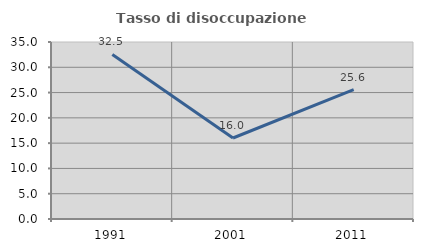
| Category | Tasso di disoccupazione giovanile  |
|---|---|
| 1991.0 | 32.53 |
| 2001.0 | 16.017 |
| 2011.0 | 25.57 |